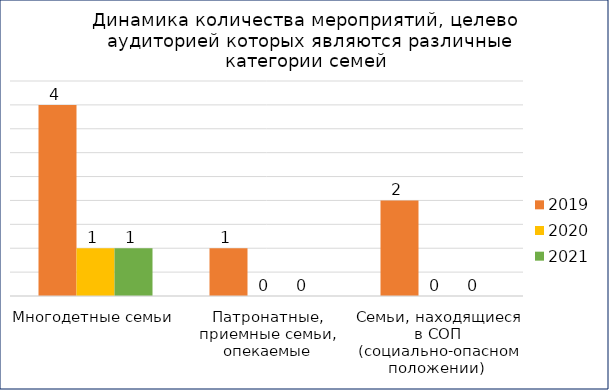
| Category | 2019 | 2020 | 2021 |
|---|---|---|---|
| Многодетные семьи  | 4 | 1 | 1 |
| Патронатные, приемные семьи, опекаемые | 1 | 0 | 0 |
| Семьи, находящиеся в СОП (социально-опасном положении)  | 2 | 0 | 0 |